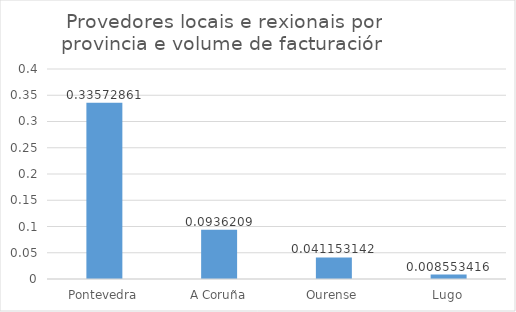
| Category | Series 0 |
|---|---|
| Pontevedra | 0.336 |
| A Coruña | 0.094 |
| Ourense | 0.041 |
| Lugo | 0.009 |